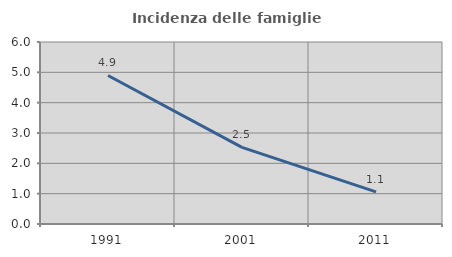
| Category | Incidenza delle famiglie numerose |
|---|---|
| 1991.0 | 4.897 |
| 2001.0 | 2.525 |
| 2011.0 | 1.058 |